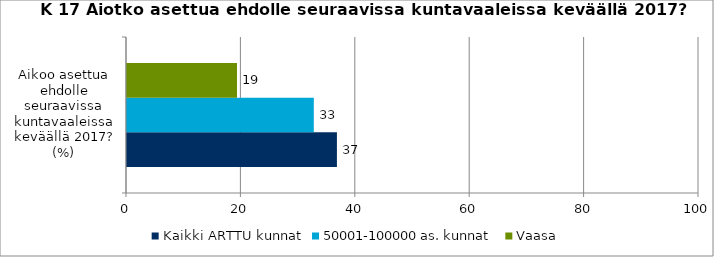
| Category | Kaikki ARTTU kunnat | 50001-100000 as. kunnat | Vaasa |
|---|---|---|---|
| Aikoo asettua ehdolle seuraavissa kuntavaaleissa keväällä 2017? (%) | 36.7 | 32.66 | 19.231 |